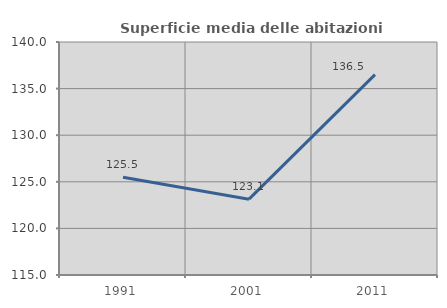
| Category | Superficie media delle abitazioni occupate |
|---|---|
| 1991.0 | 125.482 |
| 2001.0 | 123.136 |
| 2011.0 | 136.493 |